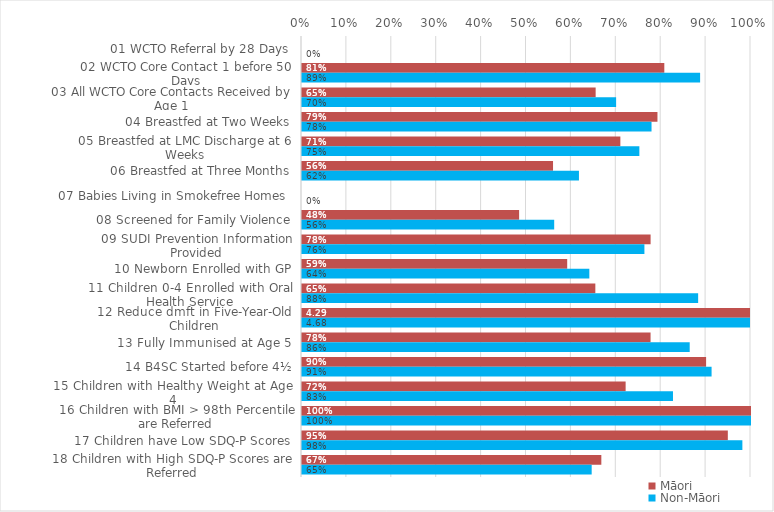
| Category | Māori | Non-Māori |
|---|---|---|
| 01 WCTO Referral by 28 Days | 0 | 0 |
| 02 WCTO Core Contact 1 before 50 Days | 0.807 | 0.887 |
| 03 All WCTO Core Contacts Received by Age 1 | 0.654 | 0.7 |
| 04 Breastfed at Two Weeks | 0.792 | 0.778 |
| 05 Breastfed at LMC Discharge at 6 Weeks | 0.709 | 0.751 |
| 06 Breastfed at Three Months | 0.559 | 0.617 |
| 07 Babies Living in Smokefree Homes  | 0 | 0 |
| 08 Screened for Family Violence | 0.484 | 0.562 |
| 09 SUDI Prevention Information Provided | 0.776 | 0.763 |
| 10 Newborn Enrolled with GP | 0.591 | 0.64 |
| 11 Children 0-4 Enrolled with Oral Health Service | 0.653 | 0.882 |
| 12 Reduce dmft in Five-Year-Old Children | 4.292 | 4.68 |
| 13 Fully Immunised at Age 5 | 0.776 | 0.863 |
| 14 B4SC Started before 4½ | 0.9 | 0.912 |
| 15 Children with Healthy Weight at Age 4 | 0.721 | 0.826 |
| 16 Children with BMI > 98th Percentile are Referred | 1 | 1 |
| 17 Children have Low SDQ-P Scores | 0.948 | 0.981 |
| 18 Children with High SDQ-P Scores are Referred | 0.667 | 0.645 |